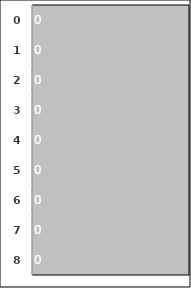
| Category | Series 0 |
|---|---|
| 0.0 | 0 |
| 1.0 | 0 |
| 2.0 | 0 |
| 3.0 | 0 |
| 4.0 | 0 |
| 5.0 | 0 |
| 6.0 | 0 |
| 7.0 | 0 |
| 8.0 | 0 |